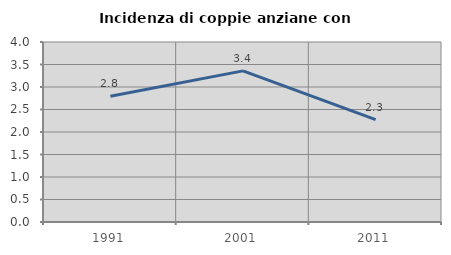
| Category | Incidenza di coppie anziane con figli |
|---|---|
| 1991.0 | 2.795 |
| 2001.0 | 3.358 |
| 2011.0 | 2.276 |